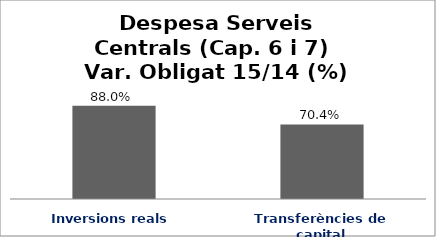
| Category | Series 0 |
|---|---|
| Inversions reals | 0.88 |
| Transferències de capital | 0.704 |